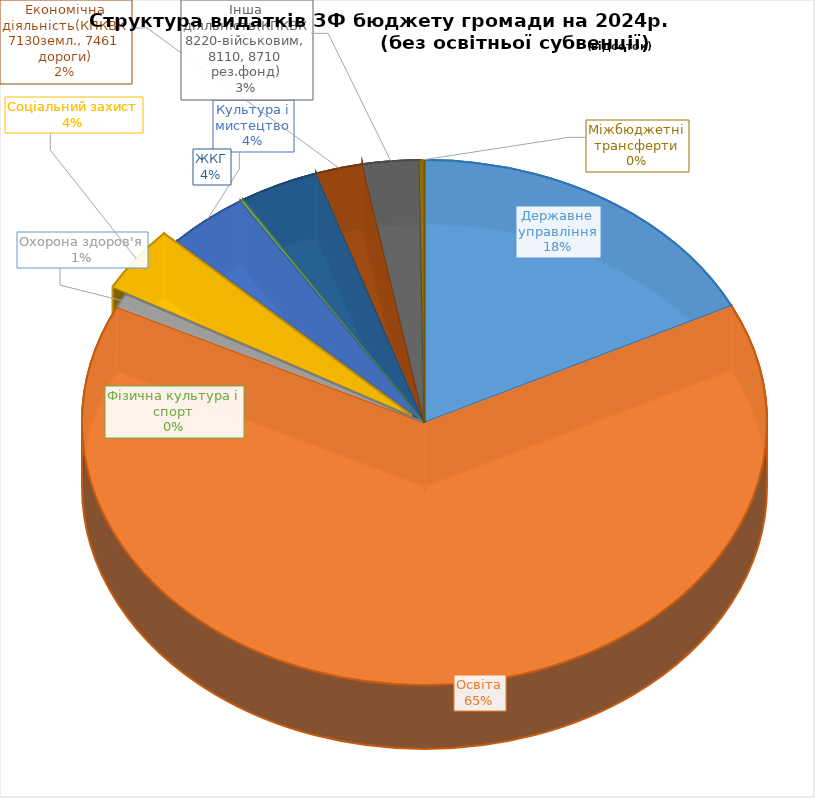
| Category | Структура видатків ЗФ бюджету громади на 2024р.                                               |
|---|---|
| Державне управління | 17.672 |
| Освіта | 64.581 |
| Охорона здоров'я | 0.889 |
| Соціальний захист | 4.016 |
| Культура і мистецтво | 3.823 |
| Фізична культура і спорт | 0.148 |
| ЖКГ | 3.754 |
| Економічна діяльність(КПКВК 7130земл., 7461 дороги) | 2.222 |
| Інша діяльність(КПКВК 8220-військовим, 8110, 8710 рез.фонд) | 2.666 |
| Міжбюджетні трансферти | 0.229 |